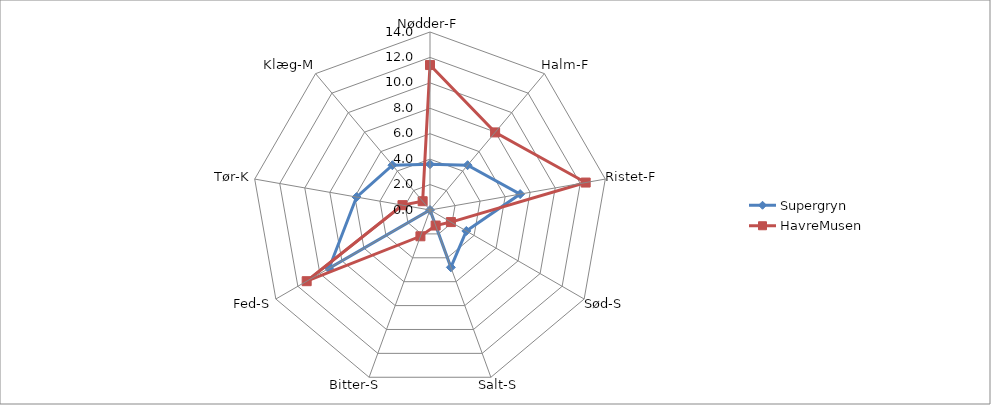
| Category | Supergryn | HavreMusen |
|---|---|---|
| Nødder-F | 3.6 | 11.4 |
| Halm-F | 4.6 | 7.967 |
| Ristet-F | 7.2 | 12.433 |
| Sød-S | 3.3 | 1.9 |
| Salt-S | 4.8 | 1.3 |
| Bitter-S | 0 | 2.2 |
| Fed-S | 9.167 | 11.2 |
| Tør-K | 5.867 | 2.2 |
| Klæg-M | 4.6 | 0.9 |